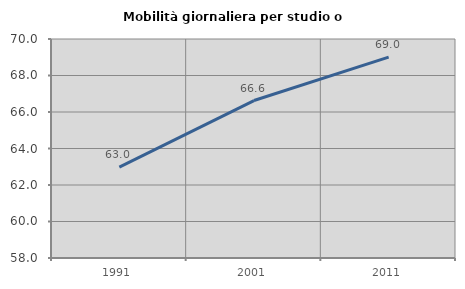
| Category | Mobilità giornaliera per studio o lavoro |
|---|---|
| 1991.0 | 62.981 |
| 2001.0 | 66.628 |
| 2011.0 | 69.003 |